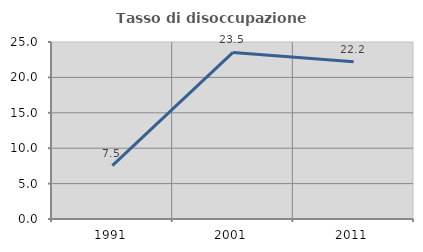
| Category | Tasso di disoccupazione giovanile  |
|---|---|
| 1991.0 | 7.547 |
| 2001.0 | 23.529 |
| 2011.0 | 22.222 |